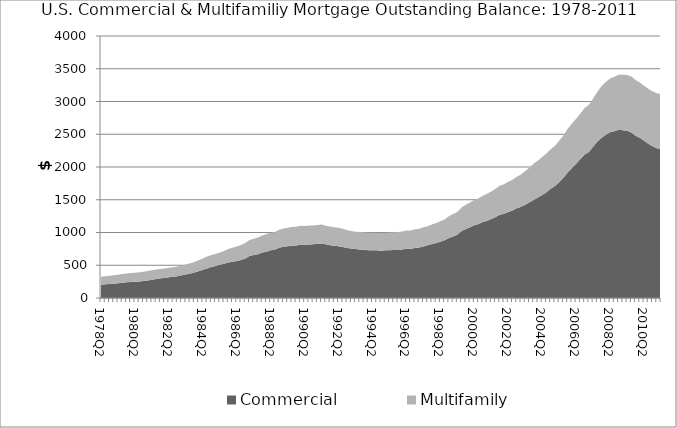
| Category | Commercial | Multifamily |
|---|---|---|
| 1978Q2 | 203.343 | 120.272 |
| 1978Q3 | 208.876 | 122.681 |
| 1978Q4 | 214.511 | 125.152 |
| 1979Q1 | 219.175 | 127.635 |
| 1979Q2 | 225.711 | 129.903 |
| 1979Q3 | 233.353 | 132.396 |
| 1979Q4 | 239.448 | 135.048 |
| 1980Q1 | 243.912 | 137.027 |
| 1980Q2 | 248.864 | 138.408 |
| 1980Q3 | 253.808 | 140.218 |
| 1980Q4 | 259.903 | 142.526 |
| 1981Q1 | 267.511 | 143.948 |
| 1981Q2 | 278.496 | 144.952 |
| 1981Q3 | 288.922 | 146.039 |
| 1981Q4 | 299.684 | 142.377 |
| 1982Q1 | 306.619 | 143.64 |
| 1982Q2 | 315.647 | 144.694 |
| 1982Q3 | 324.78 | 144.215 |
| 1982Q4 | 333.68 | 146.112 |
| 1983Q1 | 346.33 | 147.02 |
| 1983Q2 | 360.215 | 150.761 |
| 1983Q3 | 373.975 | 155.784 |
| 1983Q4 | 389.424 | 161.229 |
| 1984Q1 | 408.654 | 167.158 |
| 1984Q2 | 429.688 | 174.957 |
| 1984Q3 | 451.779 | 180.374 |
| 1984Q4 | 471.898 | 186.145 |
| 1985Q1 | 487.05 | 182.816 |
| 1985Q2 | 505.953 | 189.29 |
| 1985Q3 | 522.126 | 194.964 |
| 1985Q4 | 541.661 | 205.915 |
| 1986Q1 | 554.231 | 212.974 |
| 1986Q2 | 565.823 | 220.862 |
| 1986Q3 | 579.131 | 228.838 |
| 1986Q4 | 601.969 | 239.394 |
| 1987Q1 | 639.606 | 245.492 |
| 1987Q2 | 655.668 | 250.241 |
| 1987Q3 | 668.225 | 254.693 |
| 1987Q4 | 694.063 | 258.355 |
| 1988Q1 | 707.871 | 268.334 |
| 1988Q2 | 729.75 | 265.969 |
| 1988Q3 | 740.212 | 269.277 |
| 1988Q4 | 765.927 | 274.544 |
| 1989Q1 | 782.385 | 279.826 |
| 1989Q2 | 789.255 | 284.991 |
| 1989Q3 | 798.971 | 285.815 |
| 1989Q4 | 801.286 | 287.001 |
| 1990Q1 | 811.252 | 290.563 |
| 1990Q2 | 814.801 | 284.579 |
| 1990Q3 | 818.264 | 286.904 |
| 1990Q4 | 819.769 | 287.424 |
| 1991Q1 | 827.227 | 288.957 |
| 1991Q2 | 831.448 | 290.203 |
| 1991Q3 | 819.475 | 282.656 |
| 1991Q4 | 806.399 | 284.108 |
| 1992Q1 | 797.409 | 283.928 |
| 1992Q2 | 791.918 | 280.081 |
| 1992Q3 | 780.395 | 276.591 |
| 1992Q4 | 762.72 | 270.935 |
| 1993Q1 | 755.776 | 268.831 |
| 1993Q2 | 746.891 | 265.988 |
| 1993Q3 | 741.309 | 264.685 |
| 1993Q4 | 737.758 | 267.689 |
| 1994Q1 | 729.243 | 267.548 |
| 1994Q2 | 728.961 | 268.641 |
| 1994Q3 | 729.031 | 268.475 |
| 1994Q4 | 722.924 | 268.212 |
| 1995Q1 | 728.416 | 267.138 |
| 1995Q2 | 730.846 | 269.246 |
| 1995Q3 | 733.543 | 270.358 |
| 1995Q4 | 733.987 | 273.85 |
| 1996Q1 | 741.42 | 274.711 |
| 1996Q2 | 750.951 | 277.944 |
| 1996Q3 | 751.47 | 280.374 |
| 1996Q4 | 763.598 | 286.11 |
| 1997Q1 | 771.144 | 286.35 |
| 1997Q2 | 787.977 | 290.383 |
| 1997Q3 | 804.69 | 292.563 |
| 1997Q4 | 825.632 | 297.848 |
| 1998Q1 | 839.586 | 304.306 |
| 1998Q2 | 858.714 | 311.35 |
| 1998Q3 | 880.63 | 319.732 |
| 1998Q4 | 916.281 | 331.472 |
| 1999Q1 | 940.776 | 341.576 |
| 1999Q2 | 964.066 | 348.059 |
| 1999Q3 | 1021.673 | 358.647 |
| 1999Q4 | 1053.023 | 372.489 |
| 2000Q1 | 1079.722 | 379.203 |
| 2000Q2 | 1109.452 | 388.004 |
| 2000Q3 | 1131.478 | 393.294 |
| 2000Q4 | 1159.634 | 402.071 |
| 2001Q1 | 1179.653 | 410.174 |
| 2001Q2 | 1205.557 | 420.535 |
| 2001Q3 | 1237.831 | 431.249 |
| 2001Q4 | 1269.437 | 444.123 |
| 2002Q1 | 1286.752 | 450.268 |
| 2002Q2 | 1313.867 | 459.633 |
| 2002Q3 | 1337.467 | 466.666 |
| 2002Q4 | 1369.629 | 483.092 |
| 2003Q1 | 1391.363 | 494.613 |
| 2003Q2 | 1425.536 | 512.976 |
| 2003Q3 | 1461.249 | 529.301 |
| 2003Q4 | 1496.836 | 557.296 |
| 2004Q1 | 1533.159 | 565.705 |
| 2004Q2 | 1572.266 | 580.281 |
| 2004Q3 | 1613.68 | 591.737 |
| 2004Q4 | 1668.285 | 604.525 |
| 2005Q1 | 1710.01 | 615.174 |
| 2005Q2 | 1768.385 | 631.537 |
| 2005Q3 | 1834.67 | 647.13 |
| 2005Q4 | 1916.533 | 666.809 |
| 2006Q1 | 1985.582 | 679.573 |
| 2006Q2 | 2051.202 | 686.296 |
| 2006Q3 | 2121.095 | 694.085 |
| 2006Q4 | 2191.409 | 707.513 |
| 2007Q1 | 2229.716 | 720.298 |
| 2007Q2 | 2307.896 | 738.251 |
| 2007Q3 | 2391.027 | 759.125 |
| 2007Q4 | 2448.299 | 786.855 |
| 2008Q1 | 2493.166 | 803.285 |
| 2008Q2 | 2531.339 | 818.991 |
| 2008Q3 | 2545.5 | 832.698 |
| 2008Q4 | 2566.961 | 840.25 |
| 2009Q1 | 2562.409 | 845.47 |
| 2009Q2 | 2551.604 | 852.794 |
| 2009Q3 | 2526.137 | 855.732 |
| 2009Q4 | 2478.444 | 849.256 |
| 2010Q1 | 2446.065 | 843.36 |
| 2010Q2 | 2400.104 | 839.883 |
| 2010Q3 | 2354.78 | 840.93 |
| 2010Q4 | 2317.758 | 839.35 |
| 2011Q1 | 2287.847 | 838.881 |
| 2011Q2 | 2273.323 | 839.916 |